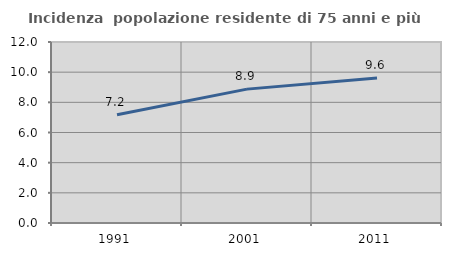
| Category | Incidenza  popolazione residente di 75 anni e più |
|---|---|
| 1991.0 | 7.18 |
| 2001.0 | 8.876 |
| 2011.0 | 9.61 |